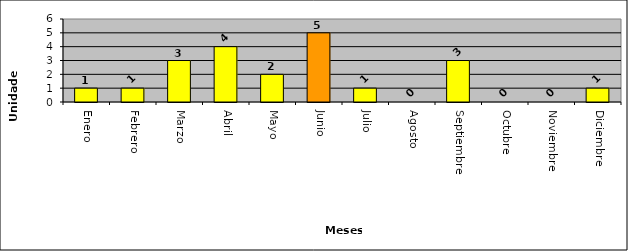
| Category |  Extranjeros deportados |
|---|---|
| Enero | 1 |
| Febrero | 1 |
| Marzo | 3 |
| Abril | 4 |
| Mayo | 2 |
| Junio | 5 |
| Julio | 1 |
| Agosto | 0 |
| Septiembre | 3 |
| Octubre | 0 |
| Noviembre | 0 |
| Diciembre | 1 |